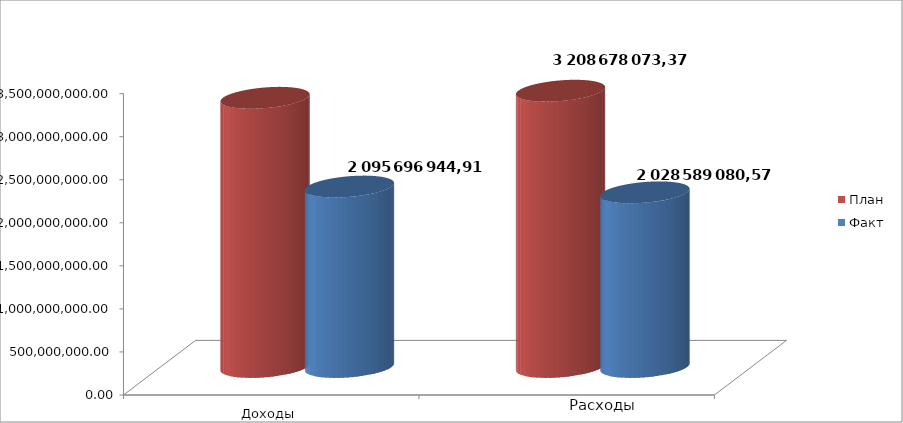
| Category | План | Факт |
|---|---|---|
| 0 | 3126345054.49 | 2095696944.91 |
| 1 | 3208678073.37 | 2028589080.57 |